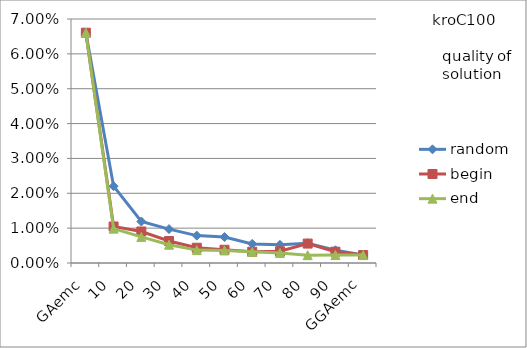
| Category | random | begin | end |
|---|---|---|---|
| 0 | 0.066 | 0.066 | 0.066 |
| 1 | 0.022 | 0.01 | 0.01 |
| 2 | 0.012 | 0.009 | 0.007 |
| 3 | 0.01 | 0.006 | 0.005 |
| 4 | 0.008 | 0.004 | 0.004 |
| 5 | 0.007 | 0.004 | 0.004 |
| 6 | 0.005 | 0.003 | 0.003 |
| 7 | 0.005 | 0.003 | 0.003 |
| 8 | 0.006 | 0.006 | 0.002 |
| 9 | 0.004 | 0.003 | 0.002 |
| 10 | 0.002 | 0.002 | 0.002 |